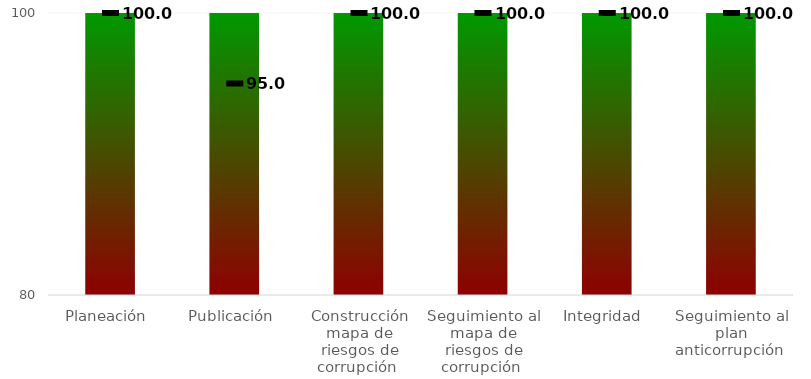
| Category | Niveles |
|---|---|
| Planeación  | 100 |
| Publicación  | 100 |
| Construcción mapa de riesgos de corrupción  | 100 |
| Seguimiento al mapa de riesgos de corrupción  | 100 |
| Integridad  | 100 |
| Seguimiento al plan anticorrupción  | 100 |